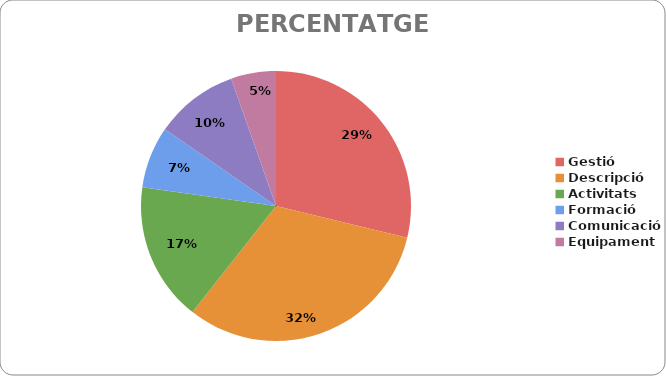
| Category | Series 0 |
|---|---|
| Gestió | 187 |
| Descripció | 207 |
| Activitats | 108 |
| Formació | 48 |
| Comunicació | 65 |
| Equipament | 35 |